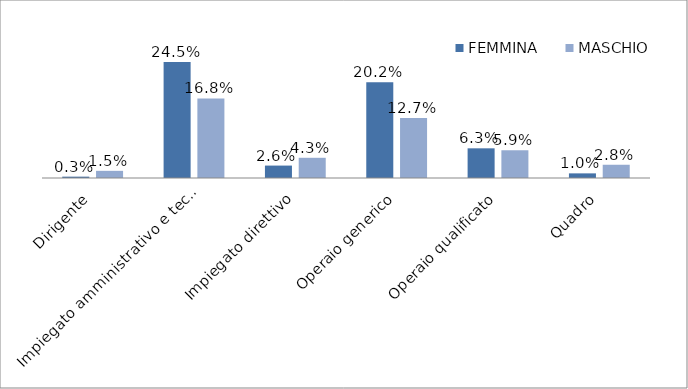
| Category | FEMMINA | MASCHIO |
|---|---|---|
| Dirigente | 0.003 | 0.015 |
| Impiegato amministrativo e tecnico | 0.245 | 0.168 |
| Impiegato direttivo | 0.026 | 0.043 |
| Operaio generico | 0.202 | 0.127 |
| Operaio qualificato | 0.063 | 0.059 |
| Quadro | 0.01 | 0.028 |